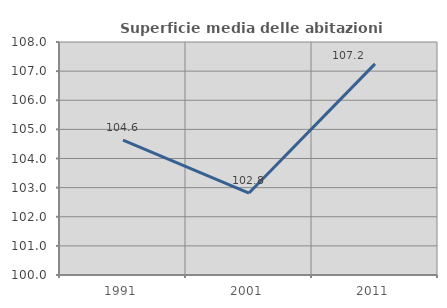
| Category | Superficie media delle abitazioni occupate |
|---|---|
| 1991.0 | 104.632 |
| 2001.0 | 102.814 |
| 2011.0 | 107.249 |